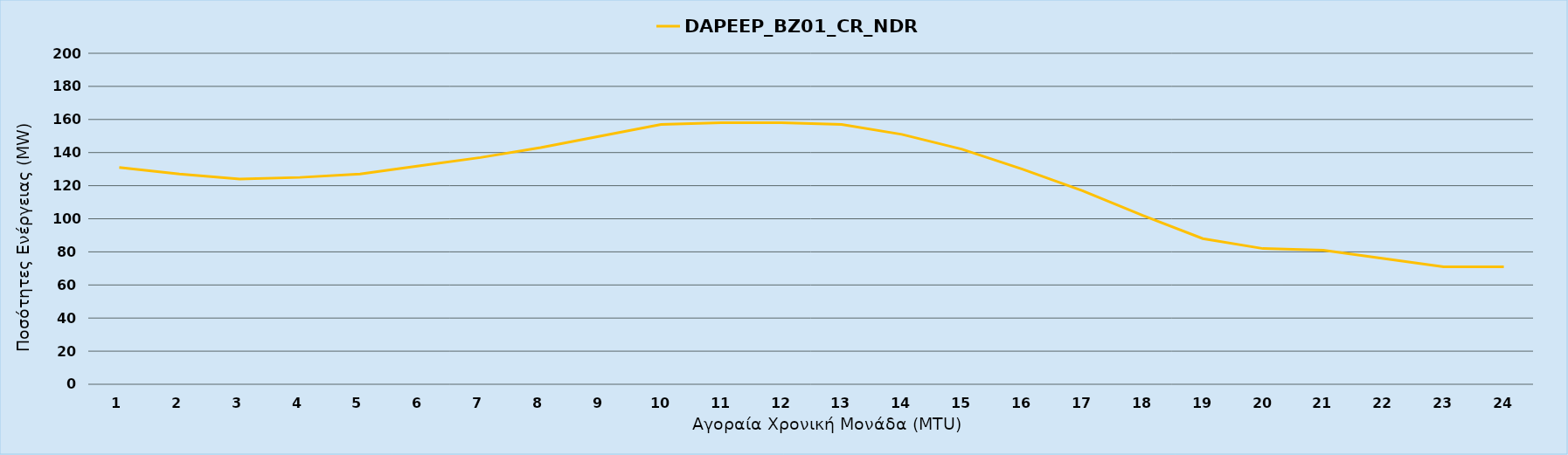
| Category | DAPEEP_BZ01_CR_NDR |
|---|---|
| 0 | 131 |
| 1 | 127 |
| 2 | 124 |
| 3 | 125 |
| 4 | 127 |
| 5 | 132 |
| 6 | 137 |
| 7 | 143 |
| 8 | 150 |
| 9 | 157 |
| 10 | 158 |
| 11 | 158 |
| 12 | 157 |
| 13 | 151 |
| 14 | 142 |
| 15 | 130 |
| 16 | 117 |
| 17 | 102 |
| 18 | 88 |
| 19 | 82 |
| 20 | 81 |
| 21 | 76 |
| 22 | 71 |
| 23 | 71 |